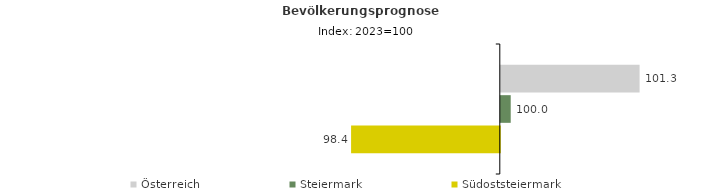
| Category | Österreich | Steiermark | Südoststeiermark |
|---|---|---|---|
| 2023.0 | 101.3 | 100 | 98.4 |